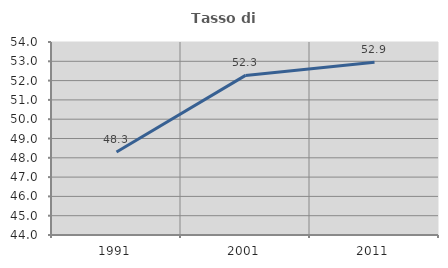
| Category | Tasso di occupazione   |
|---|---|
| 1991.0 | 48.299 |
| 2001.0 | 52.269 |
| 2011.0 | 52.945 |